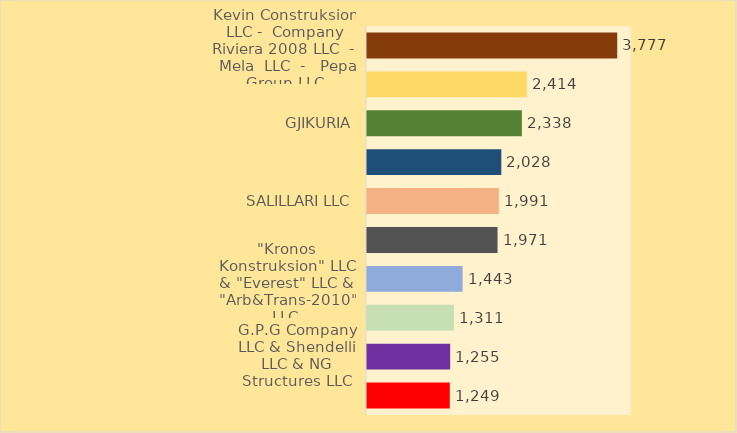
| Category | Winning Bid in million Lek |
|---|---|
| Kevin Construksion LLC -  Company Riviera 2008 LLC  -   Mela  LLC  -   Pepa Group LLC | 3777 |
| “Ante-Group”LLC - “Ferro Beton&Construction Co” LLC | 2413.537 |
| GJIKURIA | 2337.904 |
| G.P.G. COMPANY | 2027.585 |
| SALILLARI LLC | 1990.642 |
| 2T LLC & VELLEZERIT HYSA LLC & ADRIATIK LLC | 1970.731 |
| "Kronos Konstruksion" LLC & "Everest" LLC & "Arb&Trans-2010" LLC | 1443.046 |
| Erzeni/Sh LLC - Senka LLC - Dajti Park 2007 LLC | 1310.992 |
| G.P.G Company LLC & Shendelli LLC & NG Structures LLC | 1255.222 |
| ERGI  LLC-  BE - IS LLC | 1249.408 |